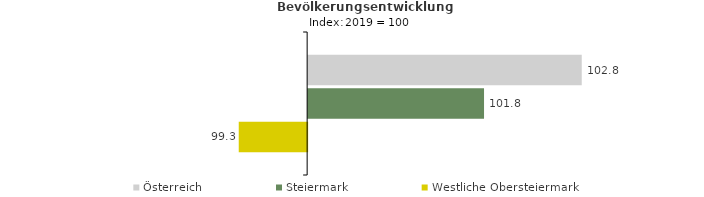
| Category | Österreich | Steiermark | Westliche Obersteiermark |
|---|---|---|---|
| 2023.0 | 102.8 | 101.8 | 99.3 |